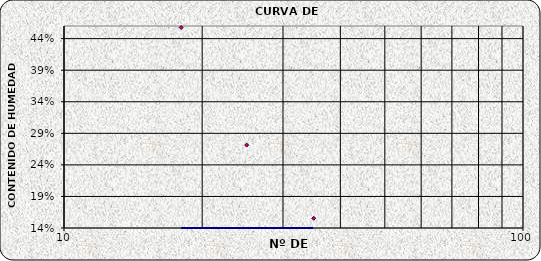
| Category | Series 0 |
|---|---|
| 35.0 | 0.155 |
| 25.0 | 0.271 |
| 18.0 | 0.458 |